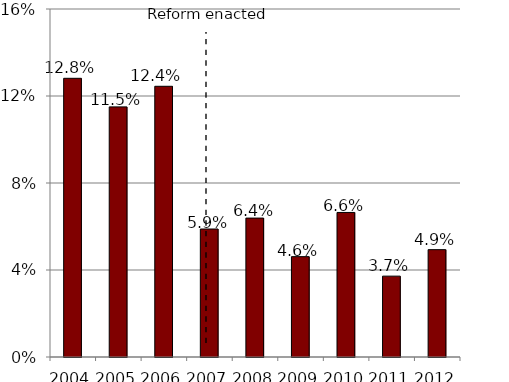
| Category | Percent uninsured, all MA residents |
|---|---|
| 2004.0 | 0.128 |
| 2005.0 | 0.115 |
| 2006.0 | 0.124 |
| 2007.0 | 0.059 |
| 2008.0 | 0.064 |
| 2009.0 | 0.046 |
| 2010.0 | 0.066 |
| 2011.0 | 0.037 |
| 2012.0 | 0.049 |